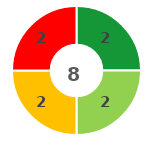
| Category | Series 0 |
|---|---|
| 0 | 2 |
| 1 | 2 |
| 2 | 2 |
| 3 | 2 |
| 4 | 0 |